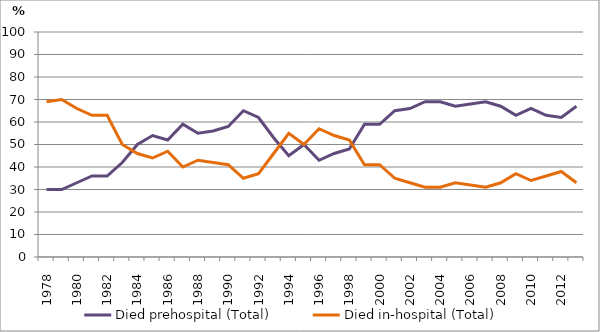
| Category | Died prehospital (Total) | Died in-hospital (Total) |
|---|---|---|
| 1978.0 | 30 | 69 |
| 1979.0 | 30 | 70 |
| 1980.0 | 33 | 66 |
| 1981.0 | 36 | 63 |
| 1982.0 | 36 | 63 |
| 1983.0 | 42 | 50 |
| 1984.0 | 50 | 46 |
| 1985.0 | 54 | 44 |
| 1986.0 | 52 | 47 |
| 1987.0 | 59 | 40 |
| 1988.0 | 55 | 43 |
| 1989.0 | 56 | 42 |
| 1990.0 | 58 | 41 |
| 1991.0 | 65 | 35 |
| 1992.0 | 62 | 37 |
| 1993.0 | 53 | 46 |
| 1994.0 | 45 | 55 |
| 1995.0 | 50 | 50 |
| 1996.0 | 43 | 57 |
| 1997.0 | 46 | 54 |
| 1998.0 | 48 | 52 |
| 1999.0 | 59 | 41 |
| 2000.0 | 59 | 41 |
| 2001.0 | 65 | 35 |
| 2002.0 | 66 | 33 |
| 2003.0 | 69 | 31 |
| 2004.0 | 69 | 31 |
| 2005.0 | 67 | 33 |
| 2006.0 | 68 | 32 |
| 2007.0 | 69 | 31 |
| 2008.0 | 67 | 33 |
| 2009.0 | 63 | 37 |
| 2010.0 | 66 | 34 |
| 2011.0 | 63 | 36 |
| 2012.0 | 62 | 38 |
| 2013.0 | 67 | 33 |